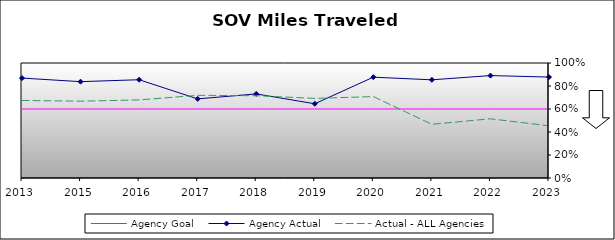
| Category | Agency Goal | Agency Actual | Actual - ALL Agencies |
|---|---|---|---|
| 2013.0 | 0.6 | 0.869 | 0.674 |
| 2015.0 | 0.6 | 0.838 | 0.668 |
| 2016.0 | 0.6 | 0.855 | 0.679 |
| 2017.0 | 0.6 | 0.688 | 0.719 |
| 2018.0 | 0.6 | 0.731 | 0.715 |
| 2019.0 | 0.6 | 0.645 | 0.692 |
| 2020.0 | 0.6 | 0.877 | 0.708 |
| 2021.0 | 0.6 | 0.854 | 0.467 |
| 2022.0 | 0.6 | 0.891 | 0.515 |
| 2023.0 | 0.6 | 0.878 | 0.454 |